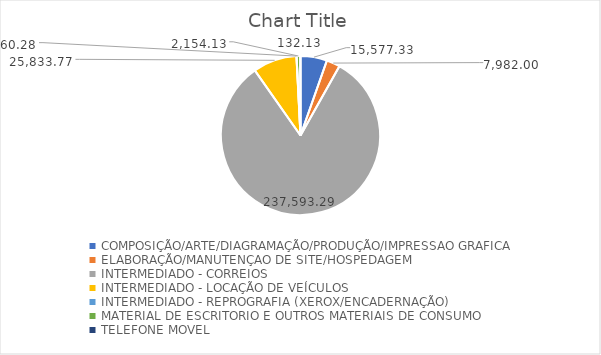
| Category | Series 0 |
|---|---|
| COMPOSIÇÃO/ARTE/DIAGRAMAÇÃO/PRODUÇÃO/IMPRESSAO GRAFICA | 15577.333 |
| ELABORAÇÃO/MANUTENÇAO DE SITE/HOSPEDAGEM | 7982 |
| INTERMEDIADO - CORREIOS | 237593.29 |
| INTERMEDIADO - LOCAÇÃO DE VEÍCULOS | 25833.77 |
| INTERMEDIADO - REPROGRAFIA (XEROX/ENCADERNAÇÃO) | 60.28 |
| MATERIAL DE ESCRITORIO E OUTROS MATERIAIS DE CONSUMO | 2154.133 |
| TELEFONE MOVEL | 132.133 |